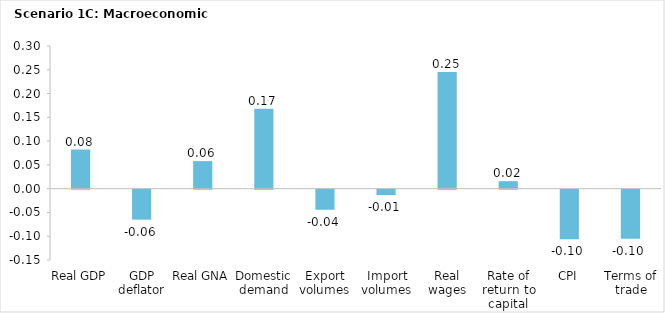
| Category | Series 0 |
|---|---|
| Real GDP | 0.082 |
| GDP deflator | -0.063 |
| Real GNA | 0.058 |
| Domestic demand | 0.168 |
| Export volumes | -0.042 |
| Import volumes | -0.011 |
| Real wages | 0.245 |
| Rate of return to capital | 0.016 |
| CPI | -0.104 |
| Terms of trade | -0.103 |